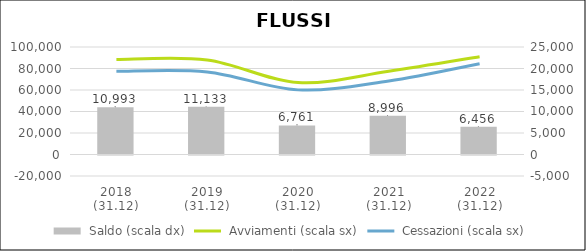
| Category | Series 2 |
|---|---|
| 2018
(31.12) | 10993 |
| 2019
(31.12) | 11133 |
| 2020
(31.12) | 6761 |
| 2021
(31.12) | 8996 |
| 2022
(31.12) | 6456 |